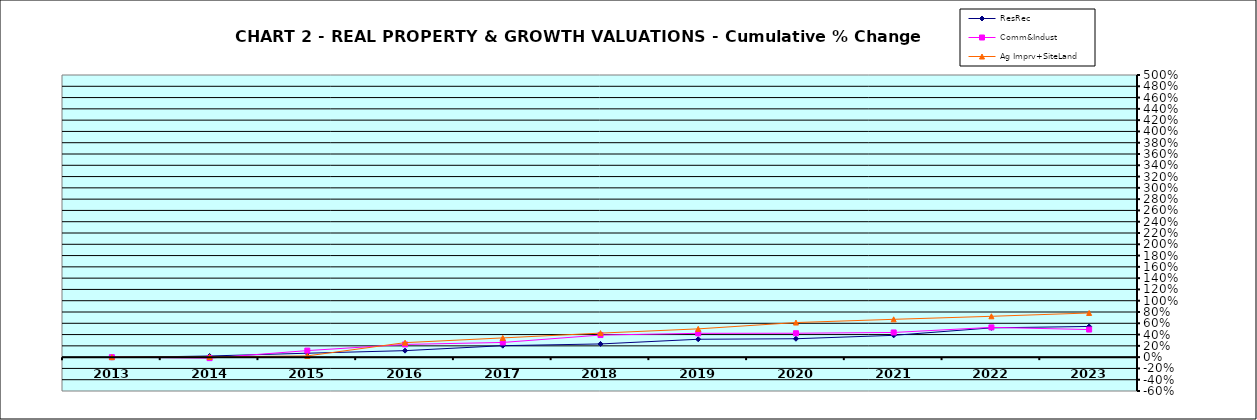
| Category | ResRec | Comm&Indust | Ag Imprv+SiteLand |
|---|---|---|---|
| 2013.0 | -0.008 | 0 | 0 |
| 2014.0 | 0.02 | -0.017 | 0.003 |
| 2015.0 | 0.07 | 0.116 | 0.022 |
| 2016.0 | 0.115 | 0.225 | 0.257 |
| 2017.0 | 0.203 | 0.26 | 0.341 |
| 2018.0 | 0.234 | 0.392 | 0.426 |
| 2019.0 | 0.317 | 0.422 | 0.501 |
| 2020.0 | 0.326 | 0.423 | 0.613 |
| 2021.0 | 0.387 | 0.437 | 0.67 |
| 2022.0 | 0.519 | 0.527 | 0.724 |
| 2023.0 | 0.544 | 0.489 | 0.783 |